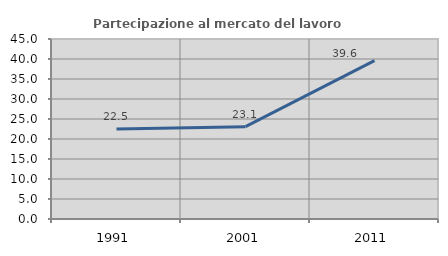
| Category | Partecipazione al mercato del lavoro  femminile |
|---|---|
| 1991.0 | 22.5 |
| 2001.0 | 23.077 |
| 2011.0 | 39.583 |